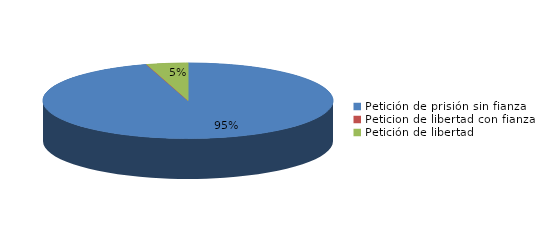
| Category | Series 0 |
|---|---|
| Petición de prisión sin fianza | 62 |
| Peticion de libertad con fianza | 0 |
| Petición de libertad | 3 |